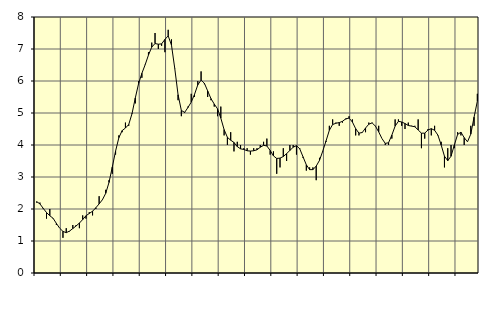
| Category | Piggar | Series 1 |
|---|---|---|
| nan | 2.2 | 2.23 |
| 87.0 | 2.2 | 2.16 |
| 87.0 | 2 | 2.02 |
| 87.0 | 1.7 | 1.89 |
| nan | 2 | 1.79 |
| 88.0 | 1.7 | 1.71 |
| 88.0 | 1.5 | 1.55 |
| 88.0 | 1.4 | 1.4 |
| nan | 1.1 | 1.3 |
| 89.0 | 1.4 | 1.26 |
| 89.0 | 1.3 | 1.31 |
| 89.0 | 1.5 | 1.39 |
| nan | 1.5 | 1.47 |
| 90.0 | 1.4 | 1.56 |
| 90.0 | 1.8 | 1.67 |
| 90.0 | 1.7 | 1.79 |
| nan | 1.9 | 1.86 |
| 91.0 | 1.8 | 1.93 |
| 91.0 | 2 | 2.04 |
| 91.0 | 2.4 | 2.16 |
| nan | 2.3 | 2.29 |
| 92.0 | 2.6 | 2.49 |
| 92.0 | 2.9 | 2.83 |
| 92.0 | 3.1 | 3.31 |
| nan | 3.7 | 3.81 |
| 93.0 | 4.3 | 4.23 |
| 93.0 | 4.4 | 4.45 |
| 93.0 | 4.7 | 4.53 |
| nan | 4.6 | 4.64 |
| 94.0 | 5 | 4.98 |
| 94.0 | 5.3 | 5.47 |
| 94.0 | 6 | 5.92 |
| nan | 6.1 | 6.24 |
| 95.0 | 6.5 | 6.51 |
| 95.0 | 6.9 | 6.81 |
| 95.0 | 7.2 | 7.06 |
| nan | 7.5 | 7.17 |
| 96.0 | 7 | 7.15 |
| 96.0 | 7.1 | 7.16 |
| 96.0 | 6.9 | 7.3 |
| nan | 7.6 | 7.41 |
| 97.0 | 7.3 | 7.12 |
| 97.0 | 6.4 | 6.39 |
| 97.0 | 5.4 | 5.57 |
| nan | 4.9 | 5.08 |
| 98.0 | 5 | 5.02 |
| 98.0 | 5.2 | 5.17 |
| 98.0 | 5.6 | 5.34 |
| nan | 5.5 | 5.58 |
| 99.0 | 6 | 5.88 |
| 99.0 | 6.3 | 6.03 |
| 99.0 | 5.9 | 5.93 |
| nan | 5.5 | 5.69 |
| 0.0 | 5.4 | 5.45 |
| 0.0 | 5.2 | 5.28 |
| 0.0 | 4.9 | 5.13 |
| nan | 5.2 | 4.84 |
| 1.0 | 4.3 | 4.48 |
| 1.0 | 4 | 4.24 |
| 1.0 | 4.4 | 4.15 |
| nan | 3.8 | 4.08 |
| 2.0 | 4.1 | 3.95 |
| 2.0 | 4 | 3.88 |
| 2.0 | 3.9 | 3.86 |
| nan | 3.9 | 3.82 |
| 3.0 | 3.7 | 3.81 |
| 3.0 | 3.9 | 3.82 |
| 3.0 | 3.9 | 3.85 |
| nan | 4 | 3.93 |
| 4.0 | 4.1 | 3.99 |
| 4.0 | 4.2 | 3.97 |
| 4.0 | 3.7 | 3.83 |
| nan | 3.8 | 3.66 |
| 5.0 | 3.1 | 3.58 |
| 5.0 | 3.3 | 3.59 |
| 5.0 | 3.9 | 3.64 |
| nan | 3.5 | 3.73 |
| 6.0 | 4 | 3.83 |
| 6.0 | 4 | 3.93 |
| 6.0 | 3.7 | 3.98 |
| nan | 3.9 | 3.88 |
| 7.0 | 3.6 | 3.63 |
| 7.0 | 3.2 | 3.38 |
| 7.0 | 3.3 | 3.23 |
| nan | 3.3 | 3.23 |
| 8.0 | 2.9 | 3.34 |
| 8.0 | 3.6 | 3.52 |
| 8.0 | 3.8 | 3.81 |
| nan | 4.1 | 4.13 |
| 9.0 | 4.6 | 4.46 |
| 9.0 | 4.8 | 4.64 |
| 9.0 | 4.7 | 4.68 |
| nan | 4.6 | 4.7 |
| 10.0 | 4.7 | 4.74 |
| 10.0 | 4.8 | 4.82 |
| 10.0 | 4.9 | 4.84 |
| nan | 4.8 | 4.72 |
| 11.0 | 4.3 | 4.51 |
| 11.0 | 4.3 | 4.37 |
| 11.0 | 4.4 | 4.39 |
| nan | 4.4 | 4.53 |
| 12.0 | 4.7 | 4.65 |
| 12.0 | 4.7 | 4.69 |
| 12.0 | 4.6 | 4.59 |
| nan | 4.6 | 4.41 |
| 13.0 | 4.2 | 4.2 |
| 13.0 | 4 | 4.05 |
| 13.0 | 4 | 4.07 |
| nan | 4.2 | 4.31 |
| 14.0 | 4.8 | 4.59 |
| 14.0 | 4.8 | 4.74 |
| 14.0 | 4.6 | 4.72 |
| nan | 4.5 | 4.67 |
| 15.0 | 4.7 | 4.61 |
| 15.0 | 4.6 | 4.59 |
| 15.0 | 4.6 | 4.57 |
| nan | 4.8 | 4.47 |
| 16.0 | 3.9 | 4.37 |
| 16.0 | 4.2 | 4.37 |
| 16.0 | 4.5 | 4.47 |
| nan | 4.3 | 4.51 |
| 17.0 | 4.6 | 4.46 |
| 17.0 | 4.3 | 4.31 |
| 17.0 | 4.1 | 4 |
| nan | 3.3 | 3.65 |
| 18.0 | 3.9 | 3.51 |
| 18.0 | 4 | 3.65 |
| 18.0 | 3.9 | 4 |
| nan | 4.4 | 4.33 |
| 19.0 | 4.3 | 4.4 |
| 19.0 | 4 | 4.23 |
| 19.0 | 4.1 | 4.1 |
| nan | 4.6 | 4.34 |
| 20.0 | 4.6 | 4.87 |
| 20.0 | 5.6 | 5.37 |